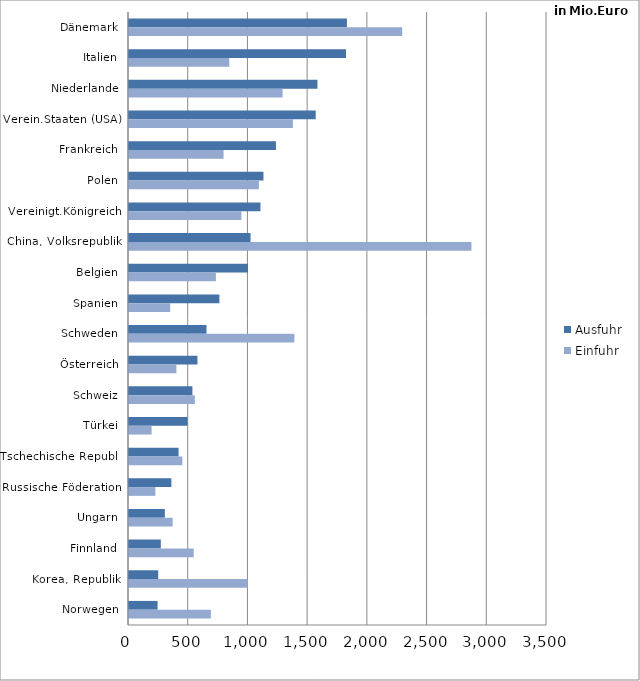
| Category | Ausfuhr | Einfuhr |
|---|---|---|
| Dänemark | 1824.846 | 2287.561 |
| Italien | 1817.102 | 839.654 |
| Niederlande | 1577.837 | 1285.83 |
| Verein.Staaten (USA) | 1563.235 | 1372.133 |
| Frankreich | 1230.561 | 791.73 |
| Polen | 1125.97 | 1087.61 |
| Vereinigt.Königreich | 1100.637 | 941.129 |
| China, Volksrepublik | 1017.694 | 2867.313 |
| Belgien | 996.673 | 727.431 |
| Spanien | 756.889 | 344.939 |
| Schweden | 648.996 | 1385.053 |
| Österreich | 573.011 | 396.925 |
| Schweiz | 530.867 | 551.35 |
| Türkei | 489.857 | 189.157 |
| Tschechische Republ. | 415.049 | 446.871 |
| Russische Föderation | 354.782 | 220.812 |
| Ungarn | 299.988 | 365.506 |
| Finnland | 266.29 | 542.108 |
| Korea, Republik | 244.74 | 993.957 |
| Norwegen | 239.302 | 685.334 |